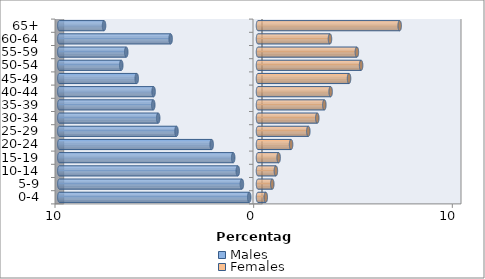
| Category | Males | Females |
|---|---|---|
| 0-4 | -0.441 | 0.39 |
| 5-9 | -0.811 | 0.718 |
| 10-14 | -1.016 | 0.901 |
| 15-19 | -1.249 | 1.039 |
| 20-24 | -2.332 | 1.665 |
| 25-29 | -4.103 | 2.533 |
| 30-34 | -5.024 | 2.984 |
| 35-39 | -5.271 | 3.339 |
| 40-44 | -5.256 | 3.656 |
| 45-49 | -6.103 | 4.583 |
| 50-54 | -6.883 | 5.19 |
| 55-59 | -6.632 | 4.977 |
| 60-64 | -4.397 | 3.623 |
| 65+ | -7.75 | 7.131 |